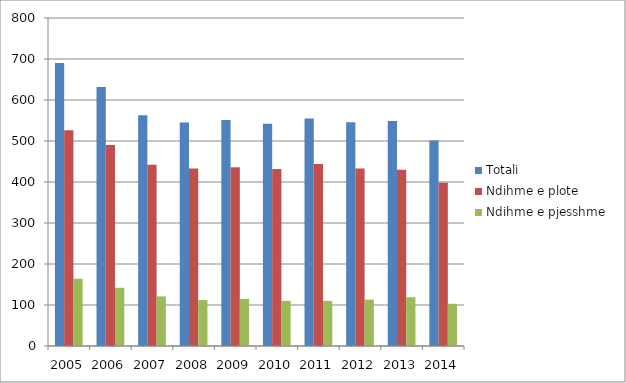
| Category | Totali | Ndihme e plote | Ndihme e pjesshme |
|---|---|---|---|
| 2005.0 | 690 | 526 | 164 |
| 2006.0 | 632 | 490 | 142 |
| 2007.0 | 563 | 442 | 121 |
| 2008.0 | 545 | 433 | 112 |
| 2009.0 | 551 | 436 | 115 |
| 2010.0 | 542 | 432 | 110 |
| 2011.0 | 555 | 444 | 110 |
| 2012.0 | 546 | 433 | 113 |
| 2013.0 | 549 | 430 | 119 |
| 2014.0 | 501 | 398 | 103 |